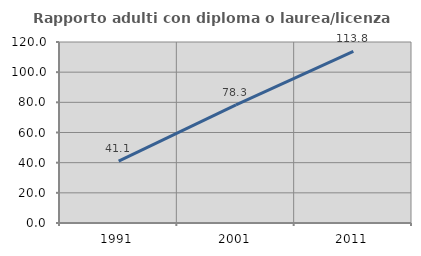
| Category | Rapporto adulti con diploma o laurea/licenza media  |
|---|---|
| 1991.0 | 41.076 |
| 2001.0 | 78.35 |
| 2011.0 | 113.771 |